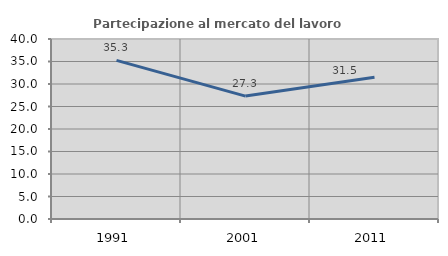
| Category | Partecipazione al mercato del lavoro  femminile |
|---|---|
| 1991.0 | 35.257 |
| 2001.0 | 27.311 |
| 2011.0 | 31.48 |